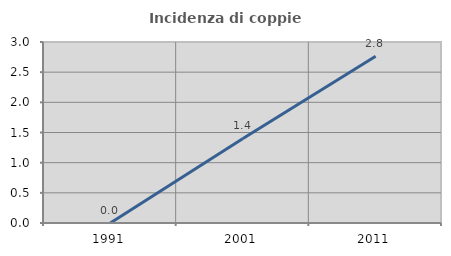
| Category | Incidenza di coppie miste |
|---|---|
| 1991.0 | 0 |
| 2001.0 | 1.402 |
| 2011.0 | 2.765 |